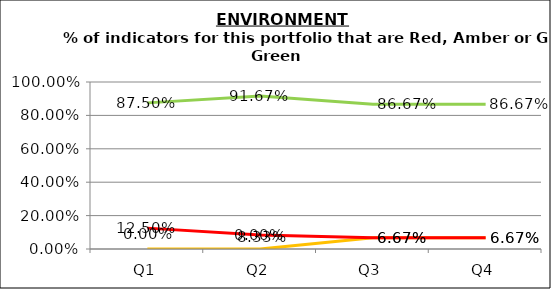
| Category | Green | Amber | Red |
|---|---|---|---|
| Q1 | 0.875 | 0 | 0.125 |
| Q2 | 0.917 | 0 | 0.083 |
| Q3 | 0.867 | 0.067 | 0.067 |
| Q4 | 0.867 | 0.067 | 0.067 |